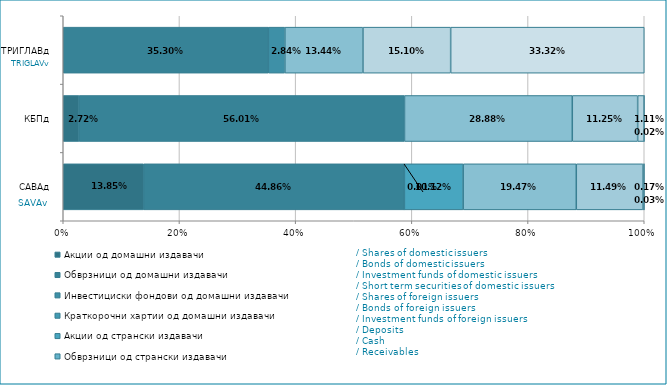
| Category | Акции од домашни издавачи  | Обврзници од домашни издавачи  | Инвестициски фондови од домашни издавачи   | Краткорочни хартии од домашни издавачи   | Акции од странски издавачи   | Обврзници од странски издавачи  | Инвестициски фондови од странски издавчи  | Депозити | Парични средства | Побарувања |
|---|---|---|---|---|---|---|---|---|---|---|
| САВАд | 0.138 | 0.449 | 0 | 0 | 0.101 | 0 | 0.195 | 0.115 | 0.002 | 0 |
| КБПд | 0.027 | 0.56 | 0 | 0 | 0 | 0 | 0.289 | 0.113 | 0.011 | 0 |
| ТРИГЛАВд | 0 | 0.353 | 0.028 | 0 | 0 | 0 | 0.134 | 0 | 0.151 | 0.333 |